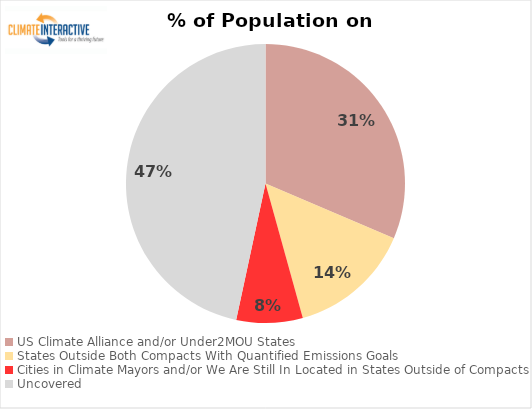
| Category | % of Population |
|---|---|
| US Climate Alliance and/or Under2MOU States | 0.314 |
| States Outside Both Compacts With Quantified Emissions Goals | 0.143 |
| Cities in Climate Mayors and/or We Are Still In Located in States Outside of Compacts | 0.077 |
| Uncovered | 0.466 |